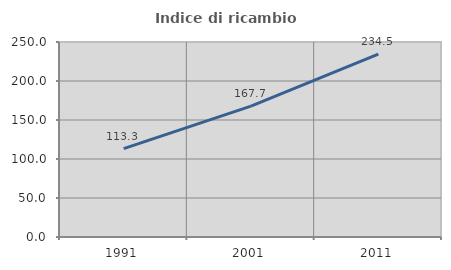
| Category | Indice di ricambio occupazionale  |
|---|---|
| 1991.0 | 113.258 |
| 2001.0 | 167.742 |
| 2011.0 | 234.468 |